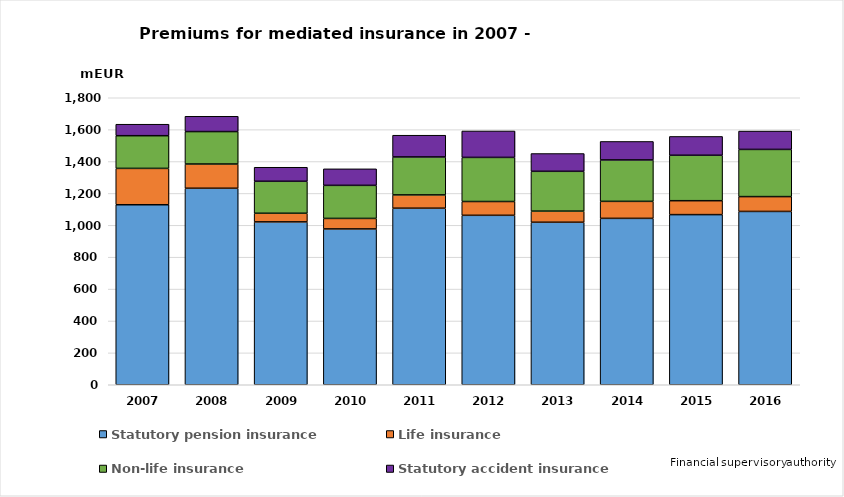
| Category | Statutory pension insurance | Life insurance | Non-life insurance | Statutory accident insurance |
|---|---|---|---|---|
| 2007.0 | 1129 | 228 | 205 | 72 |
| 2008.0 | 1232.449 | 151.996 | 203.425 | 95.962 |
| 2009.0 | 1021.457 | 54.107 | 200.56 | 88.041 |
| 2010.0 | 977.321 | 65.95 | 207.341 | 103.558 |
| 2011.0 | 1107.329 | 83.403 | 238.041 | 136.289 |
| 2012.0 | 1062.705 | 86.597 | 276.62 | 165.706 |
| 2013.0 | 1019.216 | 69.648 | 249.823 | 111.515 |
| 2014.0 | 1043.573 | 106.619 | 259.835 | 115.957 |
| 2015.0 | 1067.062 | 87.285 | 284.943 | 118.153 |
| 2016.0 | 1087 | 93 | 296 | 115 |